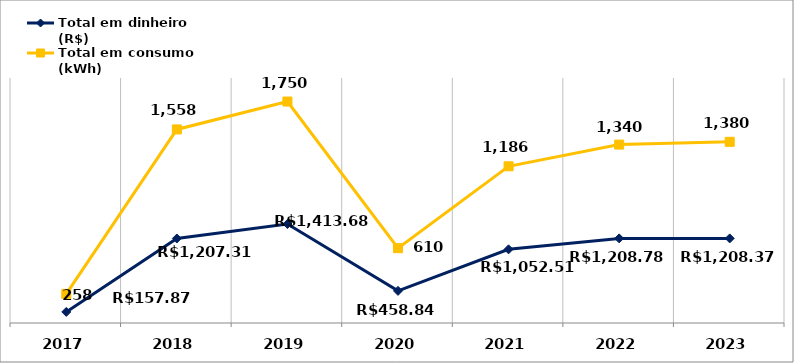
| Category | Total em dinheiro (R$) | Total em consumo (kWh) |
|---|---|---|
| 2017.0 | 157.87 | 258 |
| 2018.0 | 1207.31 | 1558 |
| 2019.0 | 1413.68 | 1750 |
| 2020.0 | 458.84 | 610 |
| 2021.0 | 1052.51 | 1186 |
| 2022.0 | 1208.78 | 1340 |
| 2023.0 | 1208.37 | 1380 |